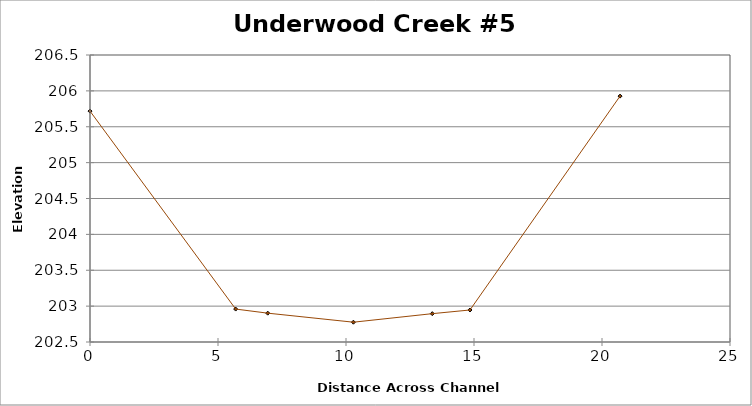
| Category | Series 0 |
|---|---|
| 0.0 | 205.718 |
| 5.690598738423971 | 202.959 |
| 6.942608803620764 | 202.902 |
| 10.28893313210704 | 202.776 |
| 13.370319741916518 | 202.895 |
| 14.842069835263953 | 202.946 |
| 20.70537369909384 | 205.927 |